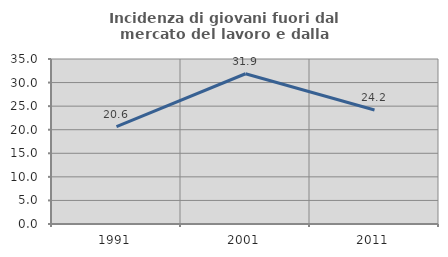
| Category | Incidenza di giovani fuori dal mercato del lavoro e dalla formazione  |
|---|---|
| 1991.0 | 20.637 |
| 2001.0 | 31.87 |
| 2011.0 | 24.18 |